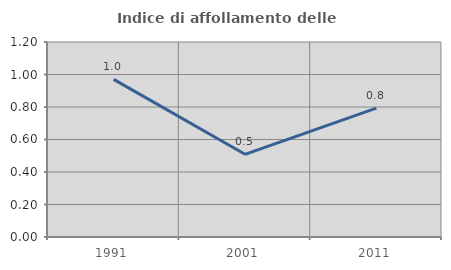
| Category | Indice di affollamento delle abitazioni  |
|---|---|
| 1991.0 | 0.97 |
| 2001.0 | 0.509 |
| 2011.0 | 0.793 |